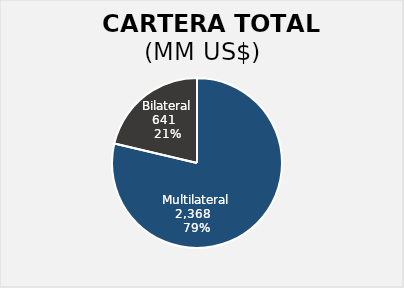
| Category | Series 0 |
|---|---|
| Multilateral | 2368.364 |
| Bilateral | 641.422 |